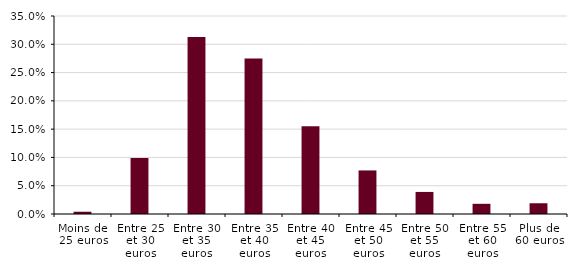
| Category | Series 0 |
|---|---|
| Moins de 25 euros | 0.004 |
| Entre 25 et 30 euros | 0.099 |
| Entre 30 et 35 euros | 0.313 |
| Entre 35 et 40 euros | 0.275 |
| Entre 40 et 45 euros | 0.155 |
| Entre 45 et 50 euros | 0.077 |
| Entre 50 et 55 euros | 0.039 |
| Entre 55 et 60 euros | 0.018 |
| Plus de 60 euros | 0.019 |